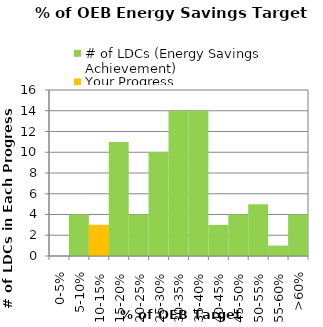
| Category | # of LDCs (Energy Savings Achievement) | Your Progress |
|---|---|---|
| 0-5% | 0 | 0 |
| 5-10% | 4 | 0 |
| 10-15% | 3 | 3 |
| 15-20% | 11 | 0 |
| 20-25% | 4 | 0 |
| 25-30% | 10 | 0 |
| 30-35% | 14 | 0 |
| 35-40% | 14 | 0 |
| 40-45% | 3 | 0 |
| 45-50% | 4 | 0 |
| 50-55% | 5 | 0 |
| 55-60% | 1 | 0 |
| >60% | 4 | 0 |